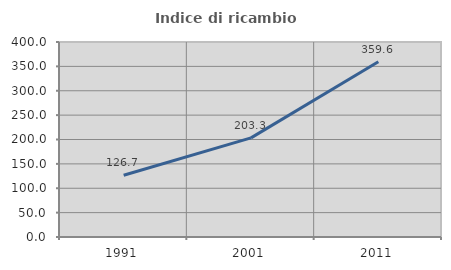
| Category | Indice di ricambio occupazionale  |
|---|---|
| 1991.0 | 126.744 |
| 2001.0 | 203.333 |
| 2011.0 | 359.574 |